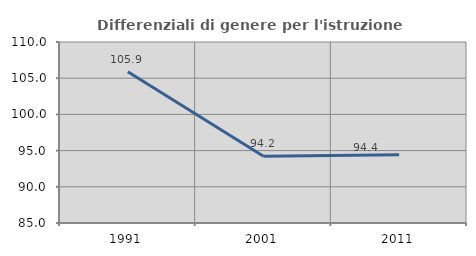
| Category | Differenziali di genere per l'istruzione superiore |
|---|---|
| 1991.0 | 105.889 |
| 2001.0 | 94.215 |
| 2011.0 | 94.444 |